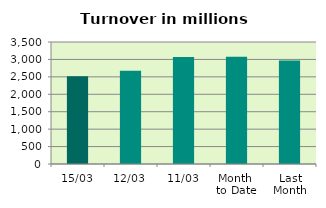
| Category | Series 0 |
|---|---|
| 15/03 | 2519.367 |
| 12/03 | 2673.721 |
| 11/03 | 3072.47 |
| Month 
to Date | 3077.877 |
| Last
Month | 2972.107 |